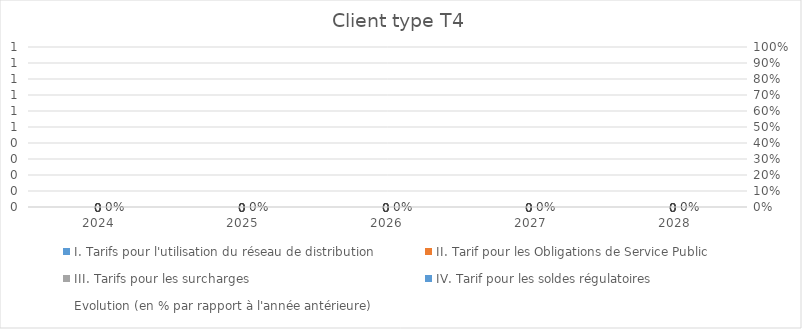
| Category | I. Tarifs pour l'utilisation du réseau de distribution | II. Tarif pour les Obligations de Service Public  | III. Tarifs pour les surcharges   | IV. Tarif pour les soldes régulatoires |
|---|---|---|---|---|
| 2024.0 | 0 | 0 | 0 | 0 |
| 2025.0 | 0 | 0 | 0 | 0 |
| 2026.0 | 0 | 0 | 0 | 0 |
| 2027.0 | 0 | 0 | 0 | 0 |
| 2028.0 | 0 | 0 | 0 | 0 |